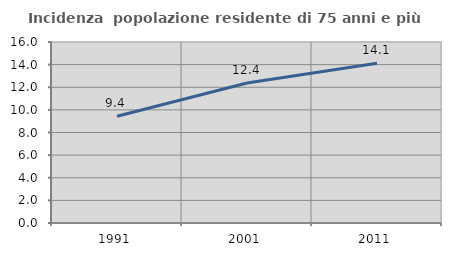
| Category | Incidenza  popolazione residente di 75 anni e più |
|---|---|
| 1991.0 | 9.433 |
| 2001.0 | 12.377 |
| 2011.0 | 14.12 |